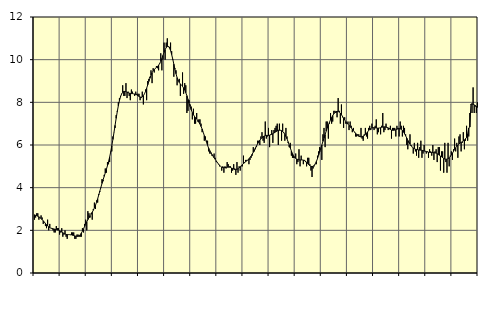
| Category | Piggar | Series 1 |
|---|---|---|
| nan | 2.5 | 2.73 |
| 87.0 | 2.6 | 2.7 |
| 87.0 | 2.8 | 2.69 |
| 87.0 | 2.8 | 2.66 |
| 87.0 | 2.5 | 2.63 |
| 87.0 | 2.6 | 2.6 |
| 87.0 | 2.7 | 2.55 |
| 87.0 | 2.6 | 2.5 |
| 87.0 | 2.3 | 2.44 |
| 87.0 | 2.4 | 2.39 |
| 87.0 | 2.2 | 2.32 |
| 87.0 | 2.1 | 2.26 |
| nan | 2.5 | 2.21 |
| 88.0 | 2 | 2.17 |
| 88.0 | 2.3 | 2.13 |
| 88.0 | 2.1 | 2.1 |
| 88.0 | 2.1 | 2.09 |
| 88.0 | 2 | 2.07 |
| 88.0 | 1.9 | 2.06 |
| 88.0 | 1.9 | 2.05 |
| 88.0 | 2.2 | 2.04 |
| 88.0 | 2.1 | 2.02 |
| 88.0 | 2.1 | 2.01 |
| 88.0 | 1.8 | 1.98 |
| nan | 1.9 | 1.95 |
| 89.0 | 2.1 | 1.92 |
| 89.0 | 1.7 | 1.89 |
| 89.0 | 1.8 | 1.85 |
| 89.0 | 2 | 1.83 |
| 89.0 | 1.7 | 1.81 |
| 89.0 | 1.6 | 1.8 |
| 89.0 | 1.8 | 1.8 |
| 89.0 | 1.8 | 1.8 |
| 89.0 | 1.8 | 1.79 |
| 89.0 | 1.9 | 1.79 |
| 89.0 | 1.9 | 1.77 |
| nan | 1.9 | 1.76 |
| 90.0 | 1.6 | 1.74 |
| 90.0 | 1.6 | 1.72 |
| 90.0 | 1.8 | 1.72 |
| 90.0 | 1.8 | 1.72 |
| 90.0 | 1.7 | 1.75 |
| 90.0 | 1.7 | 1.79 |
| 90.0 | 1.7 | 1.87 |
| 90.0 | 2.1 | 1.96 |
| 90.0 | 1.9 | 2.07 |
| 90.0 | 2.3 | 2.18 |
| 90.0 | 2.5 | 2.29 |
| nan | 2 | 2.4 |
| 91.0 | 2.9 | 2.5 |
| 91.0 | 2.8 | 2.59 |
| 91.0 | 2.6 | 2.68 |
| 91.0 | 2.8 | 2.76 |
| 91.0 | 2.5 | 2.85 |
| 91.0 | 3 | 2.94 |
| 91.0 | 3.3 | 3.05 |
| 91.0 | 3 | 3.18 |
| 91.0 | 3.4 | 3.32 |
| 91.0 | 3.3 | 3.48 |
| 91.0 | 3.7 | 3.66 |
| nan | 3.8 | 3.84 |
| 92.0 | 4 | 4.02 |
| 92.0 | 4.4 | 4.2 |
| 92.0 | 4.3 | 4.37 |
| 92.0 | 4.6 | 4.53 |
| 92.0 | 4.9 | 4.69 |
| 92.0 | 4.7 | 4.86 |
| 92.0 | 5.2 | 5.03 |
| 92.0 | 5.1 | 5.22 |
| 92.0 | 5.2 | 5.43 |
| 92.0 | 5.7 | 5.68 |
| 92.0 | 5.7 | 5.96 |
| nan | 6.4 | 6.26 |
| 93.0 | 6.6 | 6.59 |
| 93.0 | 6.8 | 6.92 |
| 93.0 | 7.4 | 7.25 |
| 93.0 | 7.6 | 7.56 |
| 93.0 | 8 | 7.84 |
| 93.0 | 8.2 | 8.08 |
| 93.0 | 8.3 | 8.26 |
| 93.0 | 8.4 | 8.39 |
| 93.0 | 8.8 | 8.47 |
| 93.0 | 8.3 | 8.51 |
| 93.0 | 8.3 | 8.51 |
| nan | 8.9 | 8.5 |
| 94.0 | 8.2 | 8.48 |
| 94.0 | 8.5 | 8.45 |
| 94.0 | 8.3 | 8.43 |
| 94.0 | 8.1 | 8.42 |
| 94.0 | 8.6 | 8.41 |
| 94.0 | 8.5 | 8.41 |
| 94.0 | 8.4 | 8.4 |
| 94.0 | 8.3 | 8.39 |
| 94.0 | 8.5 | 8.37 |
| 94.0 | 8.4 | 8.35 |
| 94.0 | 8.4 | 8.31 |
| nan | 8.4 | 8.28 |
| 95.0 | 8.1 | 8.25 |
| 95.0 | 8.2 | 8.24 |
| 95.0 | 8.5 | 8.26 |
| 95.0 | 7.9 | 8.31 |
| 95.0 | 8.4 | 8.4 |
| 95.0 | 8.6 | 8.51 |
| 95.0 | 8.1 | 8.66 |
| 95.0 | 9 | 8.82 |
| 95.0 | 9.1 | 8.98 |
| 95.0 | 9.2 | 9.13 |
| 95.0 | 9.5 | 9.27 |
| nan | 8.9 | 9.39 |
| 96.0 | 9.6 | 9.48 |
| 96.0 | 9.4 | 9.54 |
| 96.0 | 9.6 | 9.59 |
| 96.0 | 9.7 | 9.64 |
| 96.0 | 9.6 | 9.68 |
| 96.0 | 9.5 | 9.74 |
| 96.0 | 9.8 | 9.82 |
| 96.0 | 10.3 | 9.92 |
| 96.0 | 9.5 | 10.05 |
| 96.0 | 10 | 10.2 |
| 96.0 | 10.8 | 10.34 |
| nan | 10 | 10.47 |
| 97.0 | 10.8 | 10.57 |
| 97.0 | 11 | 10.62 |
| 97.0 | 10.6 | 10.62 |
| 97.0 | 10.6 | 10.55 |
| 97.0 | 10.8 | 10.43 |
| 97.0 | 10.4 | 10.24 |
| 97.0 | 10 | 10.03 |
| 97.0 | 9.2 | 9.79 |
| 97.0 | 9.6 | 9.55 |
| 97.0 | 9.5 | 9.34 |
| 97.0 | 8.8 | 9.16 |
| nan | 9 | 9.03 |
| 98.0 | 9.1 | 8.93 |
| 98.0 | 8.3 | 8.86 |
| 98.0 | 8.8 | 8.8 |
| 98.0 | 9.4 | 8.75 |
| 98.0 | 8.4 | 8.67 |
| 98.0 | 8.9 | 8.58 |
| 98.0 | 8.8 | 8.45 |
| 98.0 | 7.5 | 8.31 |
| 98.0 | 7.6 | 8.14 |
| 98.0 | 8.1 | 7.97 |
| 98.0 | 7.9 | 7.8 |
| nan | 7.8 | 7.65 |
| 99.0 | 7.2 | 7.52 |
| 99.0 | 7.7 | 7.42 |
| 99.0 | 7 | 7.34 |
| 99.0 | 7 | 7.28 |
| 99.0 | 7.5 | 7.22 |
| 99.0 | 7.1 | 7.15 |
| 99.0 | 7.2 | 7.07 |
| 99.0 | 7.2 | 6.98 |
| 99.0 | 7 | 6.87 |
| 99.0 | 6.6 | 6.75 |
| 99.0 | 6.6 | 6.6 |
| nan | 6.2 | 6.44 |
| 0.0 | 6.4 | 6.28 |
| 0.0 | 6.2 | 6.13 |
| 0.0 | 6.2 | 5.98 |
| 0.0 | 5.7 | 5.85 |
| 0.0 | 5.6 | 5.74 |
| 0.0 | 5.6 | 5.65 |
| 0.0 | 5.5 | 5.56 |
| 0.0 | 5.5 | 5.48 |
| 0.0 | 5.6 | 5.4 |
| 0.0 | 5.4 | 5.33 |
| 0.0 | 5.2 | 5.25 |
| nan | 5.2 | 5.18 |
| 1.0 | 5.1 | 5.11 |
| 1.0 | 5 | 5.05 |
| 1.0 | 5 | 5 |
| 1.0 | 4.8 | 4.96 |
| 1.0 | 5 | 4.94 |
| 1.0 | 4.7 | 4.94 |
| 1.0 | 5 | 4.94 |
| 1.0 | 4.9 | 4.95 |
| 1.0 | 5.2 | 4.96 |
| 1.0 | 5.1 | 4.96 |
| 1.0 | 5 | 4.96 |
| nan | 5 | 4.95 |
| 2.0 | 4.7 | 4.92 |
| 2.0 | 4.8 | 4.9 |
| 2.0 | 5.1 | 4.87 |
| 2.0 | 4.9 | 4.85 |
| 2.0 | 4.6 | 4.85 |
| 2.0 | 5.2 | 4.86 |
| 2.0 | 4.7 | 4.89 |
| 2.0 | 5 | 4.93 |
| 2.0 | 4.8 | 4.98 |
| 2.0 | 5 | 5.03 |
| 2.0 | 5 | 5.08 |
| nan | 5.5 | 5.13 |
| 3.0 | 5.2 | 5.17 |
| 3.0 | 5.3 | 5.22 |
| 3.0 | 5.3 | 5.26 |
| 3.0 | 5.3 | 5.3 |
| 3.0 | 5.1 | 5.35 |
| 3.0 | 5.3 | 5.41 |
| 3.0 | 5.4 | 5.48 |
| 3.0 | 5.5 | 5.57 |
| 3.0 | 5.9 | 5.66 |
| 3.0 | 5.7 | 5.76 |
| 3.0 | 5.8 | 5.87 |
| nan | 5.9 | 5.96 |
| 4.0 | 6.2 | 6.06 |
| 4.0 | 6.2 | 6.14 |
| 4.0 | 6 | 6.22 |
| 4.0 | 6.4 | 6.29 |
| 4.0 | 6.6 | 6.35 |
| 4.0 | 6.2 | 6.39 |
| 4.0 | 6.1 | 6.42 |
| 4.0 | 7.1 | 6.44 |
| 4.0 | 6.3 | 6.45 |
| 4.0 | 6.4 | 6.45 |
| 4.0 | 6.8 | 6.45 |
| nan | 5.9 | 6.46 |
| 5.0 | 6.5 | 6.48 |
| 5.0 | 6.7 | 6.5 |
| 5.0 | 6.1 | 6.53 |
| 5.0 | 6.7 | 6.56 |
| 5.0 | 6.8 | 6.6 |
| 5.0 | 6.9 | 6.63 |
| 5.0 | 7 | 6.66 |
| 5.0 | 6 | 6.69 |
| 5.0 | 7 | 6.69 |
| 5.0 | 6.7 | 6.69 |
| 5.0 | 6.2 | 6.67 |
| nan | 7 | 6.63 |
| 6.0 | 6.6 | 6.58 |
| 6.0 | 6.2 | 6.5 |
| 6.0 | 6.8 | 6.4 |
| 6.0 | 6.4 | 6.29 |
| 6.0 | 6.1 | 6.15 |
| 6.0 | 5.9 | 6 |
| 6.0 | 6.1 | 5.86 |
| 6.0 | 5.5 | 5.72 |
| 6.0 | 5.4 | 5.6 |
| 6.0 | 5.4 | 5.5 |
| 6.0 | 5.4 | 5.43 |
| nan | 5.6 | 5.37 |
| 7.0 | 5.1 | 5.34 |
| 7.0 | 5.2 | 5.32 |
| 7.0 | 5.8 | 5.3 |
| 7.0 | 5 | 5.3 |
| 7.0 | 5.5 | 5.3 |
| 7.0 | 5.3 | 5.3 |
| 7.0 | 5.1 | 5.29 |
| 7.0 | 5.3 | 5.27 |
| 7.0 | 5.2 | 5.24 |
| 7.0 | 5 | 5.19 |
| 7.0 | 5.4 | 5.14 |
| nan | 5.4 | 5.08 |
| 8.0 | 5.1 | 5.03 |
| 8.0 | 4.8 | 5 |
| 8.0 | 4.5 | 4.99 |
| 8.0 | 4.9 | 5 |
| 8.0 | 5 | 5.05 |
| 8.0 | 5.1 | 5.12 |
| 8.0 | 5.1 | 5.23 |
| 8.0 | 5.5 | 5.36 |
| 8.0 | 5.7 | 5.51 |
| 8.0 | 5.9 | 5.67 |
| 8.0 | 5.8 | 5.84 |
| nan | 5.3 | 6 |
| 9.0 | 6.5 | 6.17 |
| 9.0 | 6.8 | 6.33 |
| 9.0 | 5.9 | 6.49 |
| 9.0 | 7.1 | 6.65 |
| 9.0 | 7.1 | 6.8 |
| 9.0 | 6.3 | 6.93 |
| 9.0 | 7 | 7.06 |
| 9.0 | 7.5 | 7.18 |
| 9.0 | 7 | 7.29 |
| 9.0 | 7.1 | 7.38 |
| 9.0 | 7.6 | 7.46 |
| nan | 7.6 | 7.52 |
| 10.0 | 7.5 | 7.56 |
| 10.0 | 7.3 | 7.58 |
| 10.0 | 8.2 | 7.57 |
| 10.0 | 7.6 | 7.54 |
| 10.0 | 7 | 7.49 |
| 10.0 | 7.9 | 7.42 |
| 10.0 | 7.3 | 7.34 |
| 10.0 | 6.8 | 7.26 |
| 10.0 | 7.3 | 7.18 |
| 10.0 | 7 | 7.1 |
| 10.0 | 7 | 7.04 |
| nan | 7.1 | 6.98 |
| 11.0 | 6.7 | 6.92 |
| 11.0 | 7.1 | 6.86 |
| 11.0 | 6.9 | 6.8 |
| 11.0 | 6.6 | 6.74 |
| 11.0 | 6.8 | 6.68 |
| 11.0 | 6.6 | 6.61 |
| 11.0 | 6.4 | 6.55 |
| 11.0 | 6.4 | 6.5 |
| 11.0 | 6.5 | 6.45 |
| 11.0 | 6.5 | 6.41 |
| 11.0 | 6.4 | 6.39 |
| nan | 6.8 | 6.38 |
| 12.0 | 6.3 | 6.39 |
| 12.0 | 6.2 | 6.42 |
| 12.0 | 6.5 | 6.45 |
| 12.0 | 6.8 | 6.5 |
| 12.0 | 6.4 | 6.55 |
| 12.0 | 6.3 | 6.61 |
| 12.0 | 6.8 | 6.68 |
| 12.0 | 6.9 | 6.73 |
| 12.0 | 6.7 | 6.77 |
| 12.0 | 7 | 6.8 |
| 12.0 | 6.8 | 6.81 |
| nan | 6.7 | 6.81 |
| 13.0 | 6.9 | 6.8 |
| 13.0 | 7.2 | 6.8 |
| 13.0 | 6.5 | 6.79 |
| 13.0 | 6.6 | 6.79 |
| 13.0 | 6.8 | 6.8 |
| 13.0 | 6.5 | 6.81 |
| 13.0 | 6.9 | 6.83 |
| 13.0 | 7.5 | 6.84 |
| 13.0 | 6.6 | 6.85 |
| 13.0 | 6.7 | 6.85 |
| 13.0 | 7 | 6.84 |
| nan | 6.8 | 6.82 |
| 14.0 | 6.7 | 6.8 |
| 14.0 | 6.8 | 6.76 |
| 14.0 | 6.9 | 6.73 |
| 14.0 | 6.3 | 6.7 |
| 14.0 | 6.8 | 6.69 |
| 14.0 | 6.8 | 6.69 |
| 14.0 | 6.8 | 6.7 |
| 14.0 | 6.4 | 6.71 |
| 14.0 | 6.9 | 6.74 |
| 14.0 | 6.8 | 6.76 |
| 14.0 | 6.4 | 6.77 |
| nan | 7.1 | 6.76 |
| 15.0 | 6.9 | 6.73 |
| 15.0 | 6.4 | 6.68 |
| 15.0 | 6.9 | 6.61 |
| 15.0 | 6.8 | 6.53 |
| 15.0 | 6.5 | 6.43 |
| 15.0 | 6 | 6.33 |
| 15.0 | 5.8 | 6.22 |
| 15.0 | 6.1 | 6.13 |
| 15.0 | 6.5 | 6.04 |
| 15.0 | 6 | 5.96 |
| 15.0 | 5.9 | 5.91 |
| nan | 5.6 | 5.86 |
| 16.0 | 6.1 | 5.83 |
| 16.0 | 5.7 | 5.8 |
| 16.0 | 5.5 | 5.79 |
| 16.0 | 6.1 | 5.78 |
| 16.0 | 5.4 | 5.77 |
| 16.0 | 5.9 | 5.76 |
| 16.0 | 6.2 | 5.76 |
| 16.0 | 5.4 | 5.75 |
| 16.0 | 5.6 | 5.74 |
| 16.0 | 6 | 5.72 |
| 16.0 | 5.7 | 5.71 |
| nan | 5.6 | 5.69 |
| 17.0 | 5.7 | 5.68 |
| 17.0 | 5.4 | 5.66 |
| 17.0 | 5.8 | 5.66 |
| 17.0 | 5.7 | 5.65 |
| 17.0 | 5.5 | 5.65 |
| 17.0 | 6 | 5.65 |
| 17.0 | 5.3 | 5.64 |
| 17.0 | 5.7 | 5.63 |
| 17.0 | 5.8 | 5.62 |
| 17.0 | 5.2 | 5.59 |
| 17.0 | 5.9 | 5.56 |
| nan | 5.9 | 5.52 |
| 18.0 | 4.8 | 5.48 |
| 18.0 | 5.7 | 5.45 |
| 18.0 | 5.7 | 5.41 |
| 18.0 | 4.7 | 5.37 |
| 18.0 | 6.1 | 5.34 |
| 18.0 | 5.2 | 5.33 |
| 18.0 | 4.7 | 5.34 |
| 18.0 | 6.1 | 5.36 |
| 18.0 | 5 | 5.4 |
| 18.0 | 5.5 | 5.46 |
| 18.0 | 5.7 | 5.53 |
| nan | 5.3 | 5.62 |
| 19.0 | 5.8 | 5.7 |
| 19.0 | 6.3 | 5.79 |
| 19.0 | 5.7 | 5.87 |
| 19.0 | 6.1 | 5.94 |
| 19.0 | 5.4 | 6 |
| 19.0 | 6.4 | 6.05 |
| 19.0 | 6.5 | 6.09 |
| 19.0 | 5.7 | 6.12 |
| 19.0 | 6.1 | 6.15 |
| 19.0 | 6.6 | 6.19 |
| 19.0 | 5.8 | 6.24 |
| nan | 6.2 | 6.29 |
| 20.0 | 6.9 | 6.35 |
| 20.0 | 6.2 | 6.52 |
| 20.0 | 6.4 | 6.8 |
| 20.0 | 7.5 | 6.84 |
| 20.0 | 7.9 | 7.92 |
| 20.0 | 7.5 | 7.93 |
| 20.0 | 8.7 | 7.91 |
| 20.0 | 7.5 | 7.88 |
| 20.0 | 7.8 | 7.85 |
| 20.0 | 7.5 | 7.81 |
| 20.0 | 8 | 7.76 |